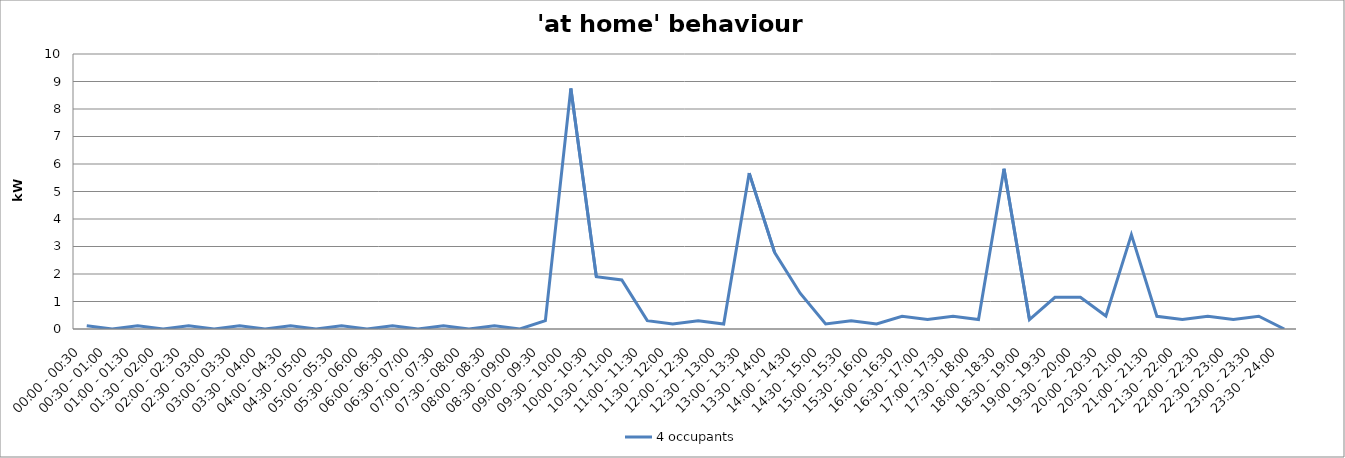
| Category | 4 occupants |
|---|---|
| 00:00 - 00:30 | 0.121 |
| 00:30 - 01:00 | 0 |
| 01:00 - 01:30 | 0.121 |
| 01:30 - 02:00 | 0 |
| 02:00 - 02:30 | 0.121 |
| 02:30 - 03:00 | 0 |
| 03:00 - 03:30 | 0.121 |
| 03:30 - 04:00 | 0 |
| 04:00 - 04:30 | 0.121 |
| 04:30 - 05:00 | 0 |
| 05:00 - 05:30 | 0.121 |
| 05:30 - 06:00 | 0 |
| 06:00 - 06:30 | 0.121 |
| 06:30 - 07:00 | 0 |
| 07:00 - 07:30 | 0.121 |
| 07:30 - 08:00 | 0 |
| 08:00 - 08:30 | 0.121 |
| 08:30 - 09:00 | 0 |
| 09:00 - 09:30 | 0.303 |
| 09:30 - 10:00 | 8.747 |
| 10:00 - 10:30 | 1.903 |
| 10:30 - 11:00 | 1.783 |
| 11:00 - 11:30 | 0.303 |
| 11:30 - 12:00 | 0.183 |
| 12:00 - 12:30 | 0.303 |
| 12:30 - 13:00 | 0.183 |
| 13:00 - 13:30 | 5.669 |
| 13:30 - 14:00 | 2.778 |
| 14:00 - 14:30 | 1.302 |
| 14:30 - 15:00 | 0.183 |
| 15:00 - 15:30 | 0.303 |
| 15:30 - 16:00 | 0.183 |
| 16:00 - 16:30 | 0.463 |
| 16:30 - 17:00 | 0.343 |
| 17:00 - 17:30 | 0.463 |
| 17:30 - 18:00 | 0.343 |
| 18:00 - 18:30 | 5.829 |
| 18:30 - 19:00 | 0.343 |
| 19:00 - 19:30 | 1.153 |
| 19:30 - 20:00 | 1.151 |
| 20:00 - 20:30 | 0.471 |
| 20:30 - 21:00 | 3.431 |
| 21:00 - 21:30 | 0.463 |
| 21:30 - 22:00 | 0.343 |
| 22:00 - 22:30 | 0.463 |
| 22:30 - 23:00 | 0.343 |
| 23:00 - 23:30 | 0.463 |
| 23:30 - 24:00 | 0 |